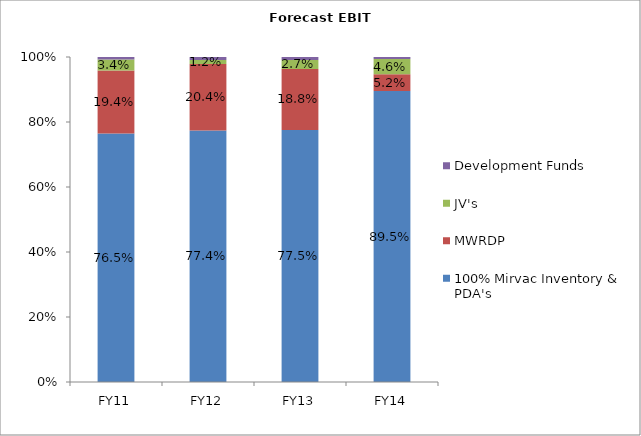
| Category | 100% Mirvac Inventory & PDA's | MWRDP | JV's | Development Funds |
|---|---|---|---|---|
| FY11 | 0.765 | 0.194 | 0.034 | 0.008 |
| FY12 | 0.774 | 0.204 | 0.012 | 0.009 |
| FY13 | 0.775 | 0.188 | 0.027 | 0.009 |
| FY14 | 0.895 | 0.052 | 0.046 | 0.006 |